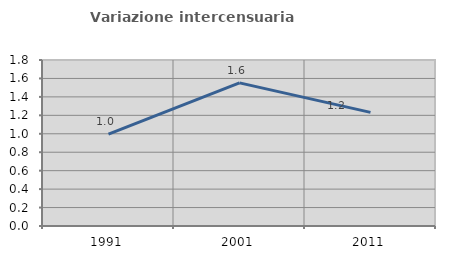
| Category | Variazione intercensuaria annua |
|---|---|
| 1991.0 | 0.996 |
| 2001.0 | 1.552 |
| 2011.0 | 1.232 |